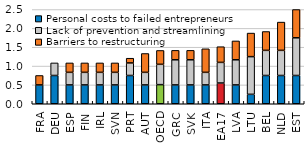
| Category | Personal costs to failed entrepreneurs | Lack of prevention and streamlining | Barriers to restructuring |
|---|---|---|---|
| FRA | 0.5 | 0 | 0.25 |
| DEU | 0.75 | 0.333 | 0 |
| ESP | 0.5 | 0.333 | 0.25 |
| FIN | 0.5 | 0.333 | 0.25 |
| IRL | 0.5 | 0.333 | 0.25 |
| SVN | 0.5 | 0.333 | 0.25 |
| PRT | 0.75 | 0.333 | 0.125 |
| AUT | 0.5 | 0.333 | 0.5 |
| OECD | 0.507 | 0.539 | 0.368 |
| GRC | 0.5 | 0.667 | 0.25 |
| SVK | 0.5 | 0.667 | 0.25 |
| ITA | 0.5 | 0.333 | 0.625 |
| EA17 | 0.55 | 0.547 | 0.416 |
| LVA | 0.5 | 0.667 | 0.5 |
| LTU | 0.25 | 1 | 0.625 |
| BEL | 0.75 | 0.667 | 0.5 |
| NLD | 0.75 | 0.667 | 0.75 |
| EST | 0.75 | 1 | 0.75 |